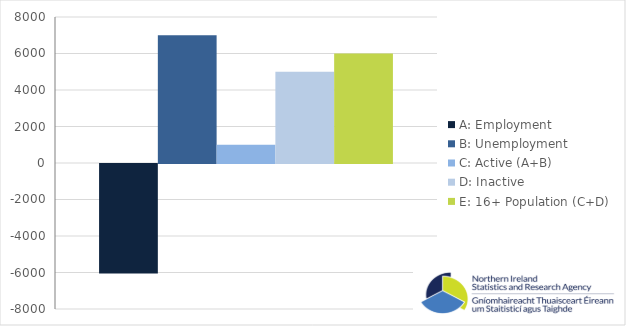
| Category | A: Employment | B: Unemployment | C: Active (A+B) | D: Inactive | E: 16+ Population (C+D) |
|---|---|---|---|---|---|
| 0 | -6000 | 7000 | 1000 | 5000 | 6000 |